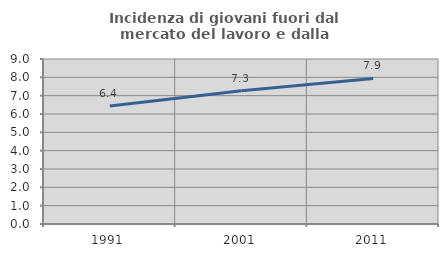
| Category | Incidenza di giovani fuori dal mercato del lavoro e dalla formazione  |
|---|---|
| 1991.0 | 6.433 |
| 2001.0 | 7.273 |
| 2011.0 | 7.937 |